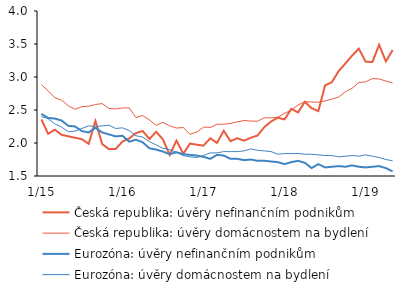
| Category | Česká republika: úvěry nefinančním podnikům | Česká republika: úvěry domácnostem na bydlení | Eurozóna: úvěry nefinančním podnikům | Eurozóna: úvěry domácnostem na bydlení |
|---|---|---|---|---|
|  1/15 | 2.357 | 2.885 | 2.44 | 2.4 |
| 2 | 2.139 | 2.79 | 2.38 | 2.37 |
| 3 | 2.202 | 2.686 | 2.37 | 2.29 |
| 4 | 2.123 | 2.649 | 2.34 | 2.24 |
| 5 | 2.101 | 2.563 | 2.26 | 2.17 |
| 6 | 2.079 | 2.511 | 2.25 | 2.18 |
| 7 | 2.058 | 2.551 | 2.18 | 2.22 |
| 8 | 1.987 | 2.557 | 2.16 | 2.26 |
| 9 | 2.333 | 2.583 | 2.23 | 2.25 |
| 10 | 1.984 | 2.598 | 2.16 | 2.26 |
| 11 | 1.907 | 2.523 | 2.13 | 2.27 |
| 12 | 1.909 | 2.516 | 2.1 | 2.22 |
|  1/16 | 2.022 | 2.531 | 2.11 | 2.23 |
| 2 | 2.069 | 2.531 | 2.02 | 2.19 |
| 3 | 2.15 | 2.386 | 2.05 | 2.11 |
| 4 | 2.181 | 2.416 | 2.01 | 2.09 |
| 5 | 2.061 | 2.349 | 1.92 | 2.02 |
| 6 | 2.17 | 2.267 | 1.9 | 1.97 |
| 7 | 2.053 | 2.314 | 1.87 | 1.92 |
| 8 | 1.819 | 2.26 | 1.83 | 1.9 |
| 9 | 2.037 | 2.226 | 1.86 | 1.86 |
| 10 | 1.837 | 2.235 | 1.83 | 1.81 |
| 11 | 1.992 | 2.133 | 1.82 | 1.79 |
| 12 | 1.974 | 2.165 | 1.81 | 1.78 |
|  1/17 | 1.96 | 2.241 | 1.79 | 1.81 |
| 2 | 2.071 | 2.235 | 1.76 | 1.85 |
| 3 | 2.002 | 2.284 | 1.82 | 1.85 |
| 4 | 2.186 | 2.284 | 1.81 | 1.87 |
| 5 | 2.027 | 2.297 | 1.76 | 1.87 |
| 6 | 2.073 | 2.32 | 1.76 | 1.87 |
| 7 | 2.035 | 2.341 | 1.74 | 1.88 |
| 8 | 2.08 | 2.332 | 1.75 | 1.91 |
| 9 | 2.113 | 2.33 | 1.73 | 1.89 |
| 10 | 2.241 | 2.382 | 1.73 | 1.88 |
| 11 | 2.325 | 2.38 | 1.72 | 1.87 |
| 12 | 2.383 | 2.392 | 1.71 | 1.83 |
|  1/18 | 2.357 | 2.449 | 1.68 | 1.84 |
| 2 | 2.517 | 2.499 | 1.71 | 1.84 |
| 3 | 2.463 | 2.576 | 1.73 | 1.84 |
| 4 | 2.624 | 2.624 | 1.7 | 1.83 |
| 5 | 2.528 | 2.621 | 1.62 | 1.83 |
| 6 | 2.483 | 2.618 | 1.68 | 1.82 |
| 7 | 2.872 | 2.637 | 1.63 | 1.81 |
| 8 | 2.921 | 2.665 | 1.64 | 1.81 |
| 9 | 3.088 | 2.696 | 1.65 | 1.79 |
| 10 | 3.204 | 2.775 | 1.64 | 1.8 |
| 11 | 3.324 | 2.829 | 1.66 | 1.81 |
| 12 | 3.429 | 2.916 | 1.64 | 1.8 |
|  1/19 | 3.233 | 2.927 | 1.63 | 1.82 |
| 2 | 3.226 | 2.977 | 1.64 | 1.8 |
| 3 | 3.487 | 2.97 | 1.65 | 1.78 |
| 4 | 3.237 | 2.939 | 1.62 | 1.75 |
| 5 | 3.408 | 2.909 | 1.57 | 1.73 |